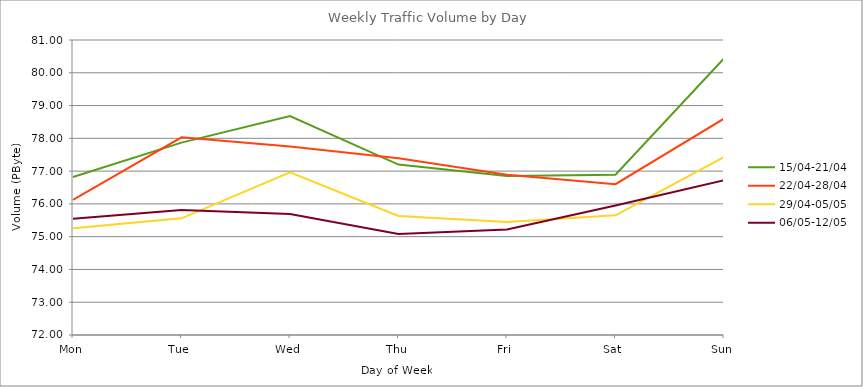
| Category | 15/04-21/04 | 22/04-28/04 | 29/04-05/05 | 06/05-12/05 |
|---|---|---|---|---|
| Mon | 76.82 | 76.12 | 75.26 | 75.55 |
| Tue | 77.87 | 78.03 | 75.56 | 75.81 |
| Wed | 78.68 | 77.75 | 76.96 | 75.69 |
| Thu | 77.2 | 77.39 | 75.63 | 75.08 |
| Fri | 76.85 | 76.89 | 75.45 | 75.22 |
| Sat | 76.89 | 76.6 | 75.65 | 75.95 |
| Sun | 80.44 | 78.6 | 77.43 | 76.72 |